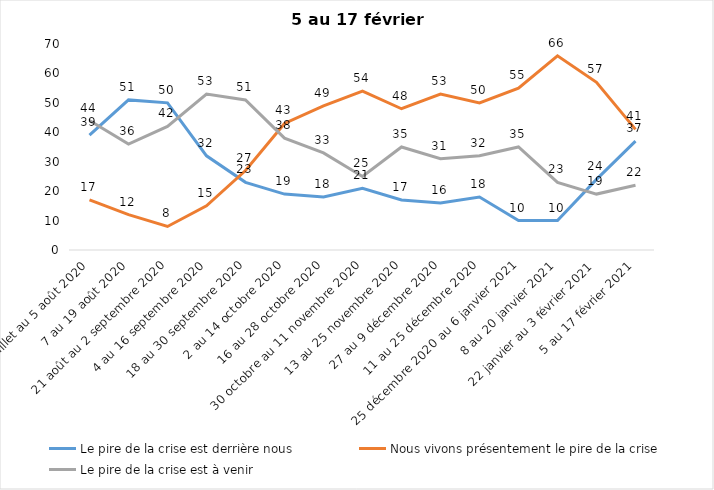
| Category | Le pire de la crise est derrière nous | Nous vivons présentement le pire de la crise | Le pire de la crise est à venir |
|---|---|---|---|
| 24 juillet au 5 août 2020 | 39 | 17 | 44 |
| 7 au 19 août 2020 | 51 | 12 | 36 |
| 21 août au 2 septembre 2020 | 50 | 8 | 42 |
| 4 au 16 septembre 2020 | 32 | 15 | 53 |
| 18 au 30 septembre 2020 | 23 | 27 | 51 |
| 2 au 14 octobre 2020 | 19 | 43 | 38 |
| 16 au 28 octobre 2020 | 18 | 49 | 33 |
| 30 octobre au 11 novembre 2020 | 21 | 54 | 25 |
| 13 au 25 novembre 2020 | 17 | 48 | 35 |
| 27 au 9 décembre 2020 | 16 | 53 | 31 |
| 11 au 25 décembre 2020 | 18 | 50 | 32 |
| 25 décembre 2020 au 6 janvier 2021 | 10 | 55 | 35 |
| 8 au 20 janvier 2021 | 10 | 66 | 23 |
| 22 janvier au 3 février 2021 | 24 | 57 | 19 |
| 5 au 17 février 2021 | 37 | 41 | 22 |